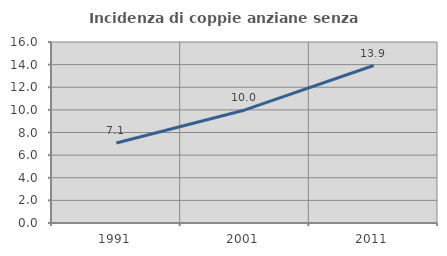
| Category | Incidenza di coppie anziane senza figli  |
|---|---|
| 1991.0 | 7.071 |
| 2001.0 | 9.995 |
| 2011.0 | 13.922 |